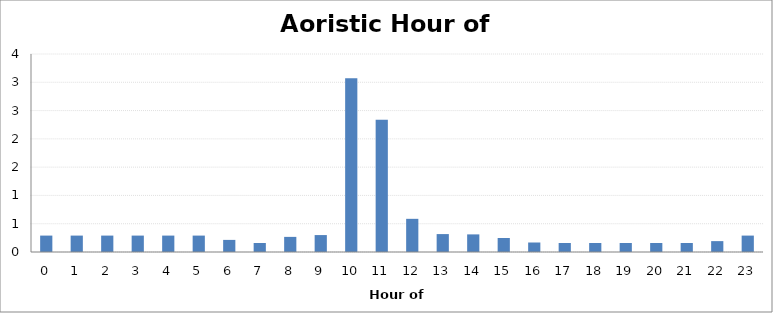
| Category | Total |
|---|---|
| 0.0 | 0.29 |
| 1.0 | 0.29 |
| 2.0 | 0.29 |
| 3.0 | 0.29 |
| 4.0 | 0.29 |
| 5.0 | 0.29 |
| 6.0 | 0.214 |
| 7.0 | 0.16 |
| 8.0 | 0.267 |
| 9.0 | 0.299 |
| 10.0 | 3.07 |
| 11.0 | 2.34 |
| 12.0 | 0.586 |
| 13.0 | 0.317 |
| 14.0 | 0.311 |
| 15.0 | 0.247 |
| 16.0 | 0.168 |
| 17.0 | 0.16 |
| 18.0 | 0.16 |
| 19.0 | 0.16 |
| 20.0 | 0.16 |
| 21.0 | 0.16 |
| 22.0 | 0.192 |
| 23.0 | 0.29 |